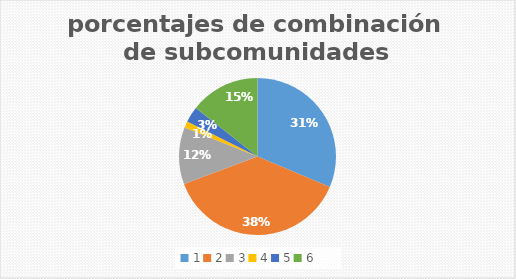
| Category | porcentajes |
|---|---|
| 1.0 | 31.373 |
| 2.0 | 37.908 |
| 3.0 | 11.765 |
| 4.0 | 1.307 |
| 5.0 | 3.268 |
| 6.0 | 14.379 |